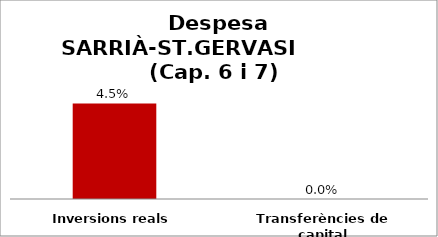
| Category | Series 0 |
|---|---|
| Inversions reals | 0.045 |
| Transferències de capital | 0 |